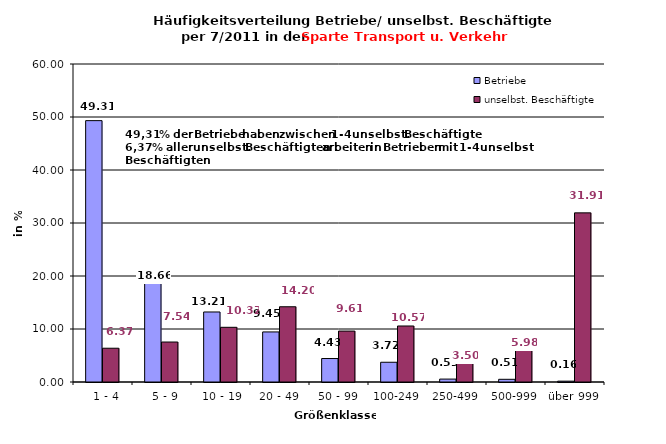
| Category | Betriebe | unselbst. Beschäftigte |
|---|---|---|
|   1 - 4 | 49.314 | 6.374 |
|   5 - 9 | 18.659 | 7.541 |
|  10 - 19 | 13.211 | 10.321 |
| 20 - 49 | 9.447 | 14.198 |
| 50 - 99 | 4.43 | 9.61 |
| 100-249 | 3.724 | 10.567 |
| 250-499 | 0.549 | 3.498 |
| 500-999 | 0.51 | 5.979 |
| über 999 | 0.157 | 31.912 |